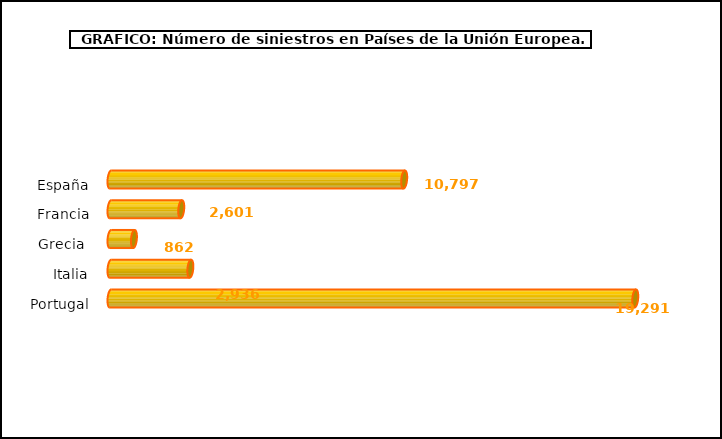
| Category | europa |
|---|---|
| España | 10797 |
| Francia | 2601 |
| Grecia  | 862 |
| Italia | 2936 |
| Portugal | 19291 |